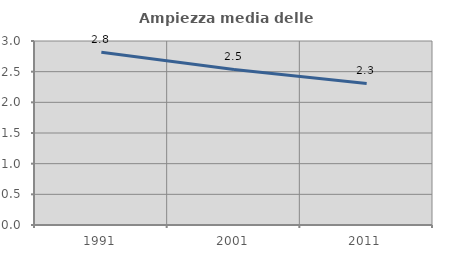
| Category | Ampiezza media delle famiglie |
|---|---|
| 1991.0 | 2.816 |
| 2001.0 | 2.536 |
| 2011.0 | 2.309 |